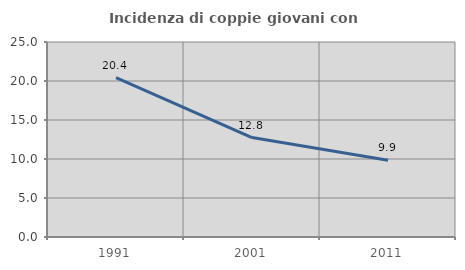
| Category | Incidenza di coppie giovani con figli |
|---|---|
| 1991.0 | 20.438 |
| 2001.0 | 12.75 |
| 2011.0 | 9.852 |